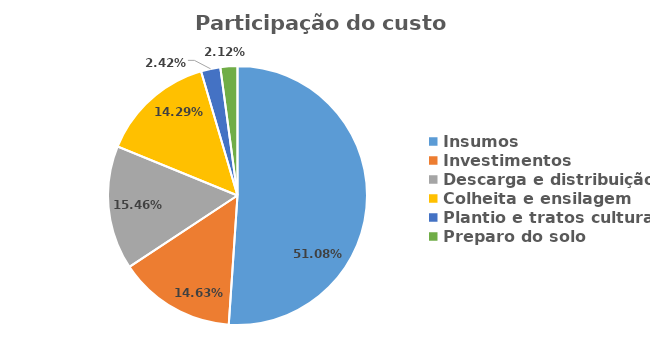
| Category | Partc. Custo |
|---|---|
| Insumos | 0.511 |
| Investimentos | 0.146 |
| Descarga e distribuição | 0.155 |
| Colheita e ensilagem | 0.143 |
| Plantio e tratos culturais | 0.024 |
| Preparo do solo | 0.021 |